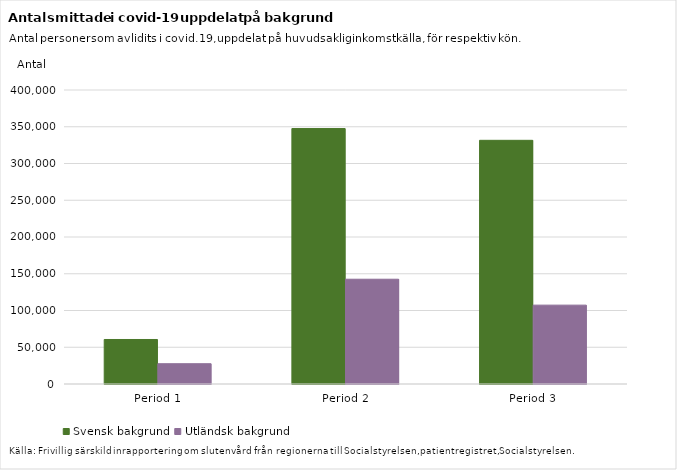
| Category | Svensk bakgrund | Utländsk bakgrund |
|---|---|---|
| Period 1 | 60564 | 27613 |
| Period 2 | 347550 | 142551 |
| Period 3 | 331527 | 107305 |